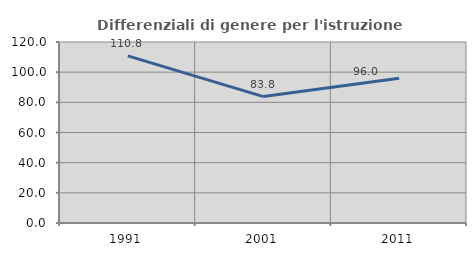
| Category | Differenziali di genere per l'istruzione superiore |
|---|---|
| 1991.0 | 110.767 |
| 2001.0 | 83.813 |
| 2011.0 | 96.005 |